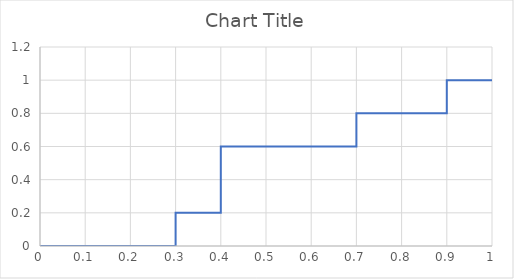
| Category | Series 0 |
|---|---|
| 0.0 | 0 |
| 0.3 | 0 |
| 0.3 | 0.2 |
| 0.4 | 0.2 |
| 0.4 | 0.4 |
| 0.4 | 0.4 |
| 0.4 | 0.6 |
| 0.7 | 0.6 |
| 0.7 | 0.8 |
| 0.9 | 0.8 |
| 0.9 | 1 |
| 1.0 | 1 |